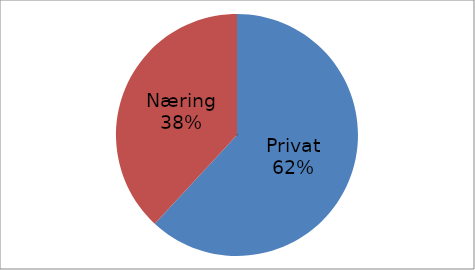
| Category | Series 0 |
|---|---|
| Privat | 34000315 |
| Næring | 20930626 |